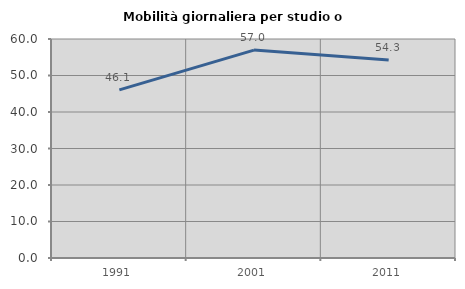
| Category | Mobilità giornaliera per studio o lavoro |
|---|---|
| 1991.0 | 46.067 |
| 2001.0 | 56.962 |
| 2011.0 | 54.255 |